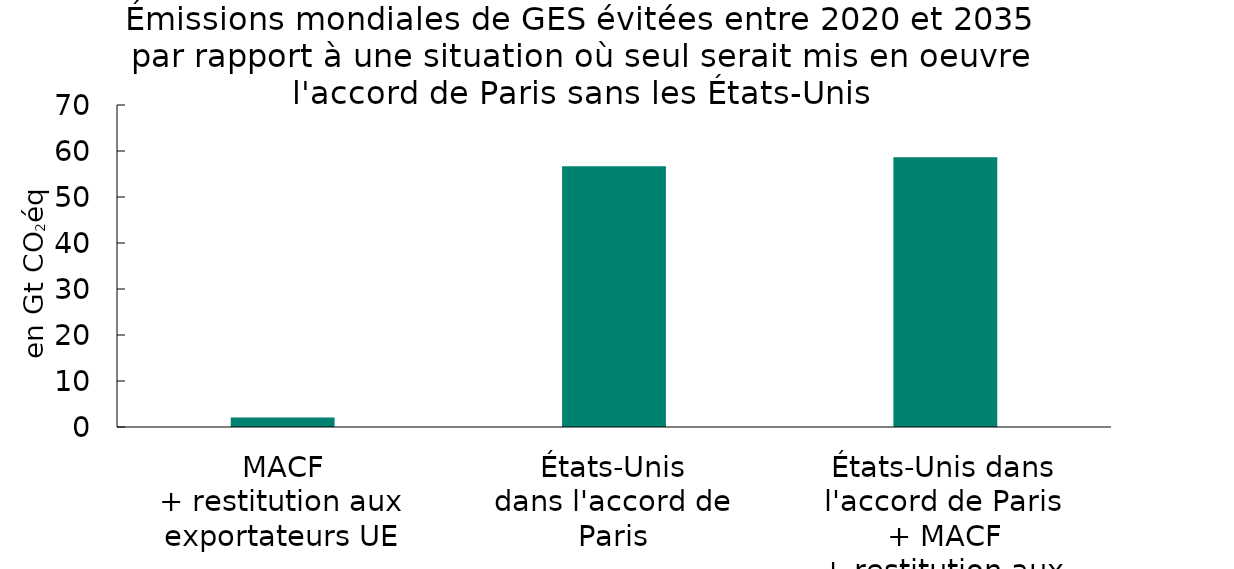
| Category | Émissions mondiales de GES évitées entre 2020 et 2035
par rapport à une situation où seul serait mis en oeuvre l'accord de Paris sans les États-Unis   |
|---|---|
| MACF
+ restitution aux exportateurs UE | 2.047 |
| États-Unis
dans l'accord de Paris | 56.675 |
| États-Unis dans l'accord de Paris
+ MACF
+ restitution aux exportateurs UE | 58.643 |